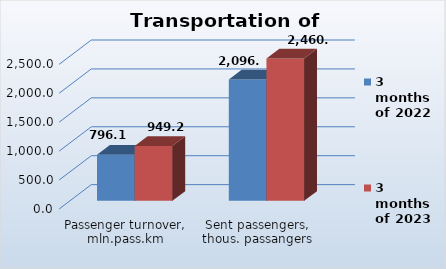
| Category | 3 months of 2022 | 3 months of 2023 |
|---|---|---|
| Passenger turnover, mln.pass.km | 796.1 | 949.2 |
| Sent passengers, thous. passangers | 2096.7 | 2460.5 |